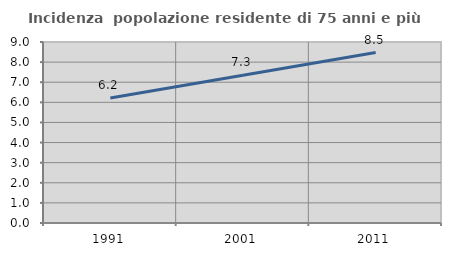
| Category | Incidenza  popolazione residente di 75 anni e più |
|---|---|
| 1991.0 | 6.214 |
| 2001.0 | 7.343 |
| 2011.0 | 8.478 |